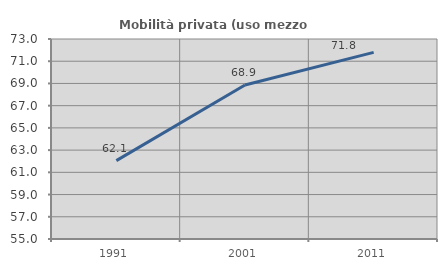
| Category | Mobilità privata (uso mezzo privato) |
|---|---|
| 1991.0 | 62.057 |
| 2001.0 | 68.856 |
| 2011.0 | 71.799 |